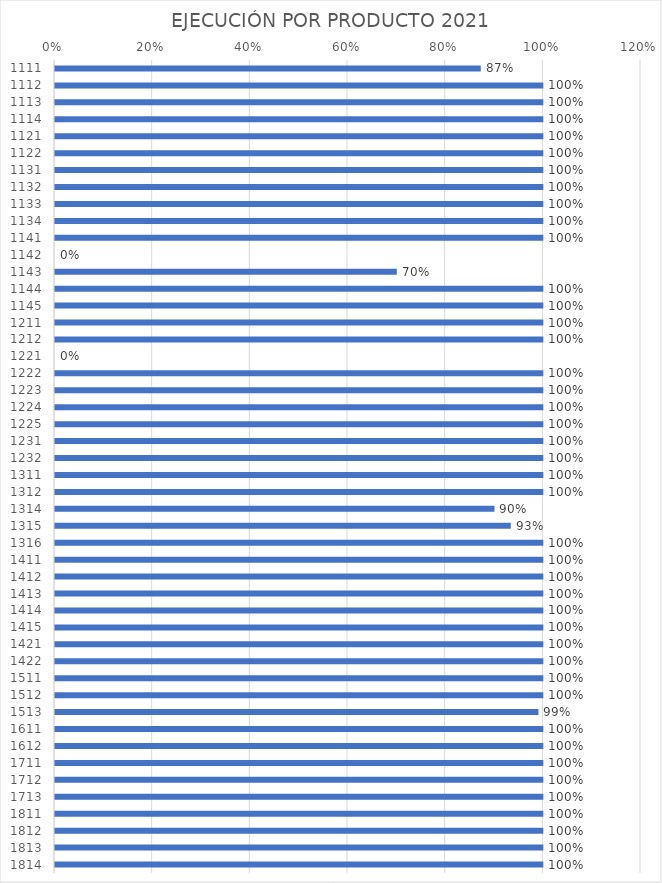
| Category | Series 0 |
|---|---|
| 1111.0 | 0.872 |
| 1112.0 | 1 |
| 1113.0 | 1 |
| 1114.0 | 1 |
| 1121.0 | 1 |
| 1122.0 | 1 |
| 1131.0 | 1 |
| 1132.0 | 1 |
| 1133.0 | 1 |
| 1134.0 | 1 |
| 1141.0 | 1 |
| 1142.0 | 0 |
| 1143.0 | 0.7 |
| 1144.0 | 1 |
| 1145.0 | 1 |
| 1211.0 | 1 |
| 1212.0 | 1 |
| 1221.0 | 0 |
| 1222.0 | 1 |
| 1223.0 | 1 |
| 1224.0 | 1 |
| 1225.0 | 1 |
| 1231.0 | 1 |
| 1232.0 | 1 |
| 1311.0 | 1 |
| 1312.0 | 1 |
| 1314.0 | 0.9 |
| 1315.0 | 0.933 |
| 1316.0 | 1 |
| 1411.0 | 1 |
| 1412.0 | 1 |
| 1413.0 | 1 |
| 1414.0 | 1 |
| 1415.0 | 1 |
| 1421.0 | 1 |
| 1422.0 | 1 |
| 1511.0 | 1 |
| 1512.0 | 1 |
| 1513.0 | 0.99 |
| 1611.0 | 1 |
| 1612.0 | 1 |
| 1711.0 | 1 |
| 1712.0 | 1 |
| 1713.0 | 1 |
| 1811.0 | 1 |
| 1812.0 | 1 |
| 1813.0 | 1 |
| 1814.0 | 1 |